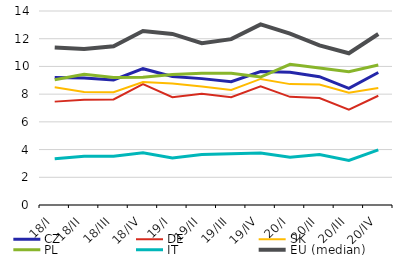
| Category | CZ | DE | SK | PL | IT | EU (median) |
|---|---|---|---|---|---|---|
| 18/I | 9.197 | 7.46 | 8.501 | 9.042 | 3.337 | 11.366 |
| 18/II | 9.163 | 7.591 | 8.148 | 9.443 | 3.524 | 11.26 |
| 18/III | 9.022 | 7.621 | 8.142 | 9.206 | 3.52 | 11.454 |
| 18/IV | 9.837 | 8.719 | 8.874 | 9.212 | 3.777 | 12.561 |
| 19/I | 9.276 | 7.776 | 8.774 | 9.422 | 3.388 | 12.343 |
| 19/II | 9.12 | 8.028 | 8.546 | 9.505 | 3.644 | 11.682 |
| 19/III | 8.894 | 7.783 | 8.302 | 9.514 | 3.698 | 11.969 |
| 19/IV | 9.633 | 8.572 | 9.099 | 9.232 | 3.754 | 13.032 |
| 20/I | 9.58 | 7.807 | 8.724 | 10.15 | 3.441 | 12.367 |
| 20/II | 9.261 | 7.716 | 8.688 | 9.885 | 3.638 | 11.522 |
| 20/III | 8.423 | 6.884 | 8.099 | 9.625 | 3.214 | 10.948 |
| 20/IV | 9.564 | 7.886 | 8.446 | 10.099 | 3.976 | 12.339 |